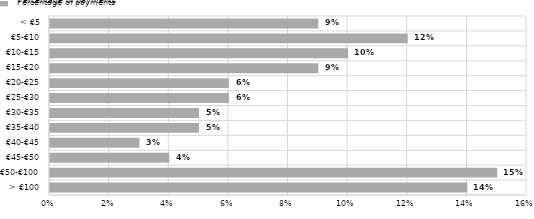
| Category | Percentage of payments |
|---|---|
| > €100 | 0.14 |
| €50-€100 | 0.15 |
| €45-€50 | 0.04 |
| €40-€45 | 0.03 |
| €35-€40 | 0.05 |
| €30-€35 | 0.05 |
| €25-€30 | 0.06 |
| €20-€25 | 0.06 |
| €15-€20 | 0.09 |
| €10-€15 | 0.1 |
| €5-€10 | 0.12 |
| < €5 | 0.09 |